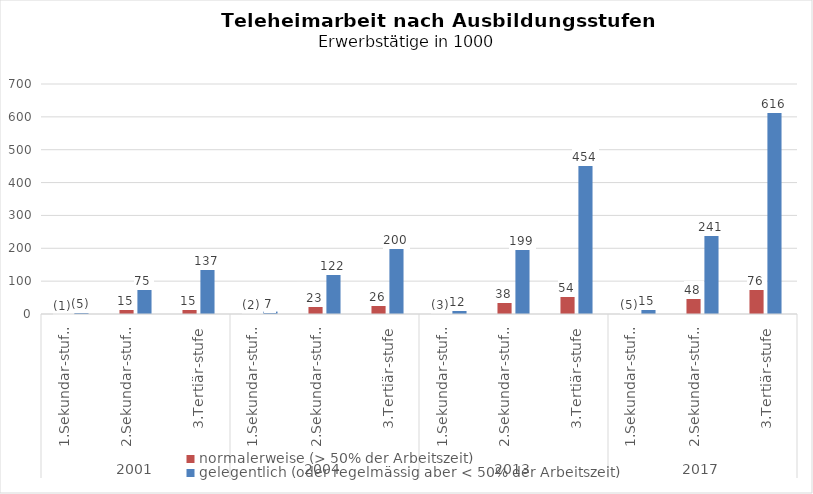
| Category | normalerweise (> 50% der Arbeitszeit) | gelegentlich (oder regelmässig aber < 50% der Arbeitszeit) |
|---|---|---|
| 0 | 1.457 | 5.098 |
| 1 | 14.624 | 74.986 |
| 2 | 15.265 | 136.869 |
| 3 | 1.999 | 7.328 |
| 4 | 23.271 | 121.797 |
| 5 | 26.395 | 199.903 |
| 6 | 2.686 | 11.617 |
| 7 | 37.804 | 198.747 |
| 8 | 53.913 | 453.729 |
| 9 | 4.519 | 15.045 |
| 10 | 47.798 | 240.675 |
| 11 | 75.663 | 615.808 |